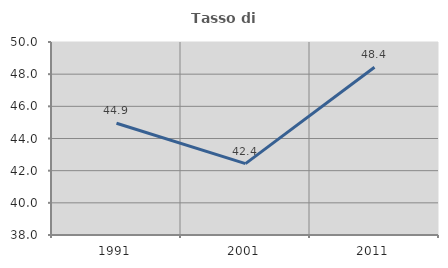
| Category | Tasso di occupazione   |
|---|---|
| 1991.0 | 44.949 |
| 2001.0 | 42.439 |
| 2011.0 | 48.43 |